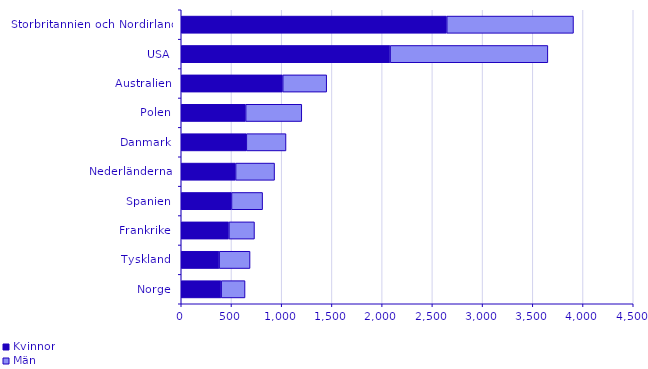
| Category | Kvinnor | Män |
|---|---|---|
| Norge | 397 | 238 |
| Tyskland | 377 | 308 |
| Frankrike | 474 | 255 |
| Spanien | 500 | 310 |
| Nederländerna | 541 | 388 |
| Danmark | 648 | 395 |
| Polen | 641 | 559 |
| Australien | 1010 | 438 |
| USA | 2079 | 1571 |
| Storbritannien och Nordirland | 2643 | 1262 |